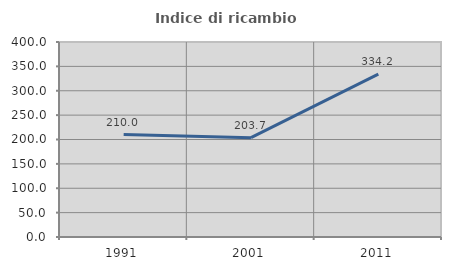
| Category | Indice di ricambio occupazionale  |
|---|---|
| 1991.0 | 210.014 |
| 2001.0 | 203.668 |
| 2011.0 | 334.161 |